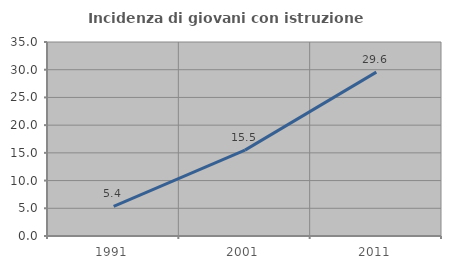
| Category | Incidenza di giovani con istruzione universitaria |
|---|---|
| 1991.0 | 5.366 |
| 2001.0 | 15.498 |
| 2011.0 | 29.57 |